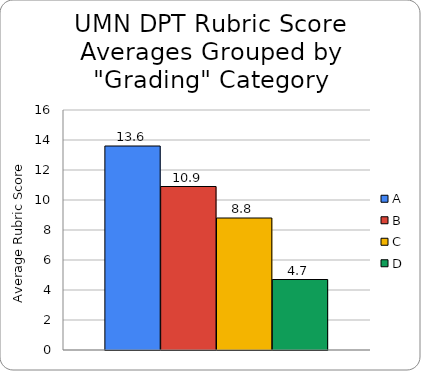
| Category | A | B | C | D |
|---|---|---|---|---|
|  | 13.6 | 10.9 | 8.8 | 4.7 |